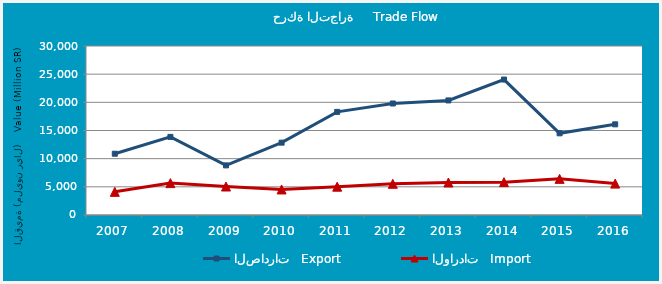
| Category | الصادرات   Export | الواردات   Import |
|---|---|---|
| 2007.0 | 10877.194 | 4108.509 |
| 2008.0 | 13866.588 | 5659.721 |
| 2009.0 | 8806.917 | 5057.802 |
| 2010.0 | 12844.584 | 4535.631 |
| 2011.0 | 18305.081 | 5027.639 |
| 2012.0 | 19793.314 | 5540.677 |
| 2013.0 | 20340.117 | 5767.26 |
| 2014.0 | 24042.184 | 5830.055 |
| 2015.0 | 14498.635 | 6413.406 |
| 2016.0 | 16093.353 | 5572.422 |